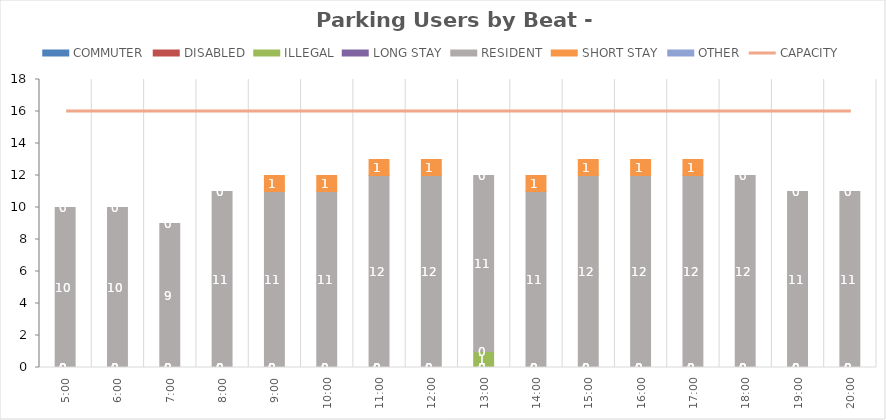
| Category | COMMUTER | DISABLED | ILLEGAL | LONG STAY | RESIDENT | SHORT STAY | OTHER |
|---|---|---|---|---|---|---|---|
| 0.20833333333333334 | 0 | 0 | 0 | 0 | 10 | 0 | 0 |
| 0.25 | 0 | 0 | 0 | 0 | 10 | 0 | 0 |
| 0.2916666666666667 | 0 | 0 | 0 | 0 | 9 | 0 | 0 |
| 0.3333333333333333 | 0 | 0 | 0 | 0 | 11 | 0 | 0 |
| 0.375 | 0 | 0 | 0 | 0 | 11 | 1 | 0 |
| 0.4166666666666667 | 0 | 0 | 0 | 0 | 11 | 1 | 0 |
| 0.4583333333333333 | 0 | 0 | 0 | 0 | 12 | 1 | 0 |
| 0.5 | 0 | 0 | 0 | 0 | 12 | 1 | 0 |
| 0.5416666666666666 | 0 | 0 | 1 | 0 | 11 | 0 | 0 |
| 0.5833333333333334 | 0 | 0 | 0 | 0 | 11 | 1 | 0 |
| 0.625 | 0 | 0 | 0 | 0 | 12 | 1 | 0 |
| 0.6666666666666666 | 0 | 0 | 0 | 0 | 12 | 1 | 0 |
| 0.7083333333333334 | 0 | 0 | 0 | 0 | 12 | 1 | 0 |
| 0.75 | 0 | 0 | 0 | 0 | 12 | 0 | 0 |
| 0.7916666666666666 | 0 | 0 | 0 | 0 | 11 | 0 | 0 |
| 0.8333333333333334 | 0 | 0 | 0 | 0 | 11 | 0 | 0 |